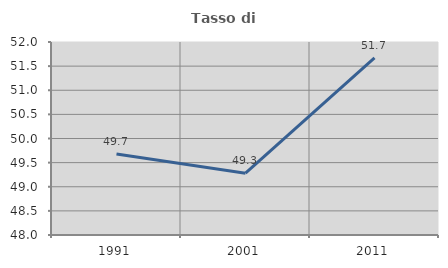
| Category | Tasso di occupazione   |
|---|---|
| 1991.0 | 49.679 |
| 2001.0 | 49.281 |
| 2011.0 | 51.671 |